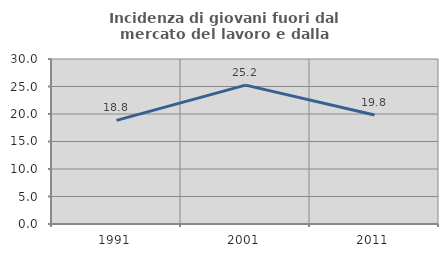
| Category | Incidenza di giovani fuori dal mercato del lavoro e dalla formazione  |
|---|---|
| 1991.0 | 18.836 |
| 2001.0 | 25.244 |
| 2011.0 | 19.817 |